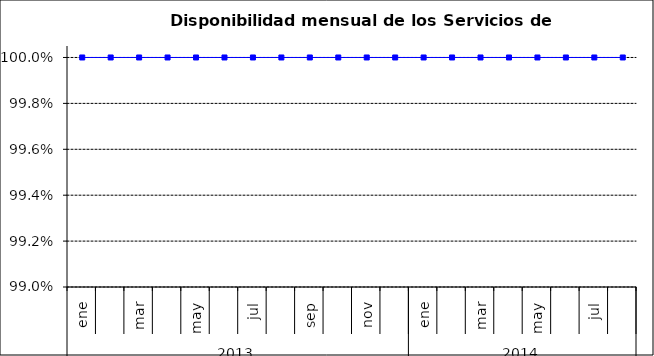
| Category | SCL |
|---|---|
| 0 | 1 |
| 1 | 1 |
| 2 | 1 |
| 3 | 1 |
| 4 | 1 |
| 5 | 1 |
| 6 | 1 |
| 7 | 1 |
| 8 | 1 |
| 9 | 1 |
| 10 | 1 |
| 11 | 1 |
| 12 | 1 |
| 13 | 1 |
| 14 | 1 |
| 15 | 1 |
| 16 | 1 |
| 17 | 1 |
| 18 | 1 |
| 19 | 1 |